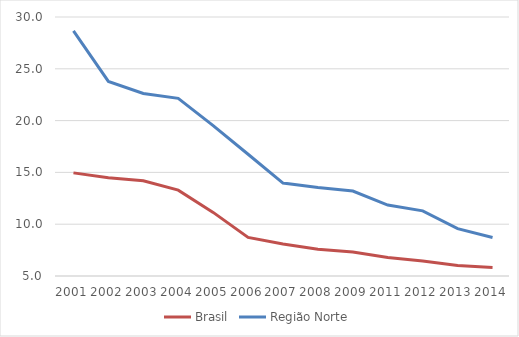
| Category | Brasil | Região Norte |
|---|---|---|
| 2001.0 | 14.955 | 28.66 |
| 2002.0 | 14.475 | 23.779 |
| 2003.0 | 14.19 | 22.619 |
| 2004.0 | 13.285 | 22.145 |
| 2005.0 | 11.14 | 19.518 |
| 2006.0 | 8.721 | 16.753 |
| 2007.0 | 8.08 | 13.97 |
| 2008.0 | 7.593 | 13.543 |
| 2009.0 | 7.309 | 13.198 |
| 2011.0 | 6.776 | 11.848 |
| 2012.0 | 6.452 | 11.29 |
| 2013.0 | 6.009 | 9.568 |
| 2014.0 | 5.816 | 8.718 |